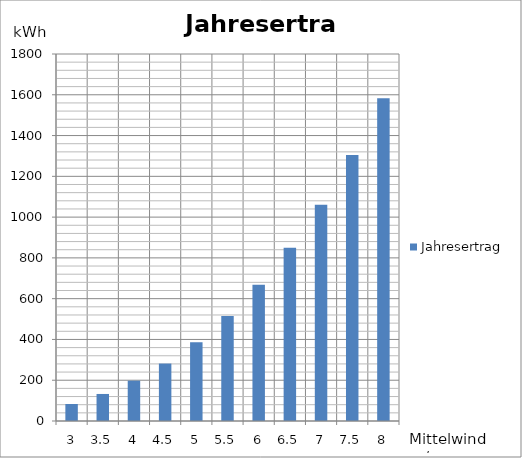
| Category | Jahresertrag |
|---|---|
| 3.0 | 83.492 |
| 3.5 | 132.582 |
| 4.0 | 197.907 |
| 4.5 | 281.785 |
| 5.0 | 386.536 |
| 5.5 | 514.48 |
| 6.0 | 667.935 |
| 6.5 | 849.221 |
| 7.0 | 1060.656 |
| 7.5 | 1304.561 |
| 8.0 | 1583.254 |